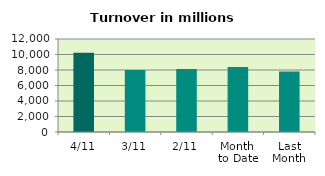
| Category | Series 0 |
|---|---|
| 4/11 | 10231.123 |
| 3/11 | 7986.069 |
| 2/11 | 8133.235 |
| Month 
to Date | 8402.743 |
| Last
Month | 7813.06 |